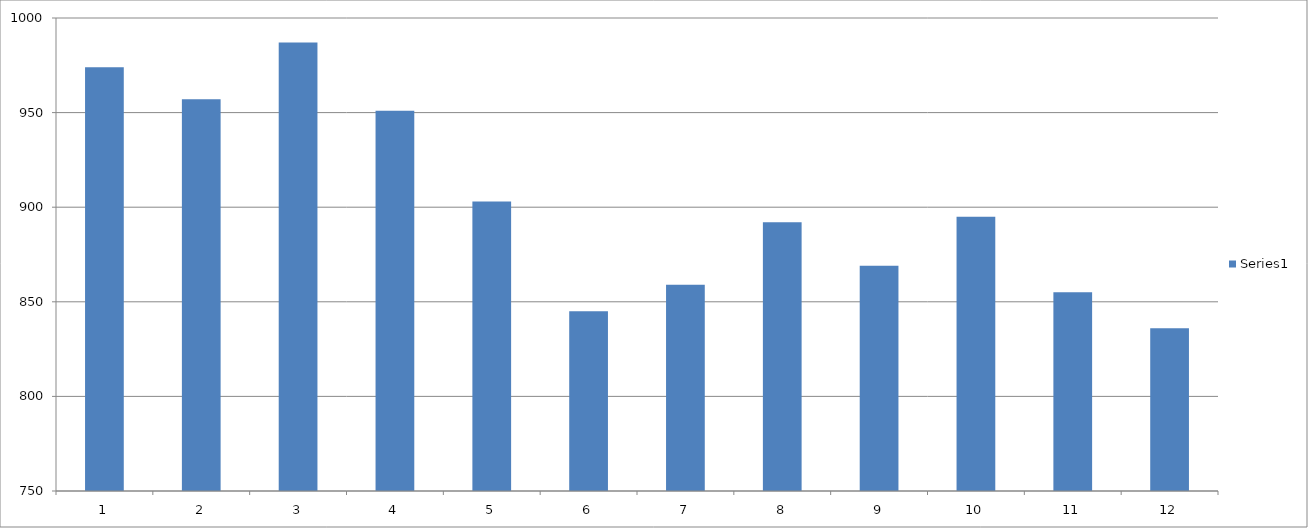
| Category | Series 0 |
|---|---|
| 0 | 974 |
| 1 | 957 |
| 2 | 987 |
| 3 | 951 |
| 4 | 903 |
| 5 | 845 |
| 6 | 859 |
| 7 | 892 |
| 8 | 869 |
| 9 | 895 |
| 10 | 855 |
| 11 | 836 |